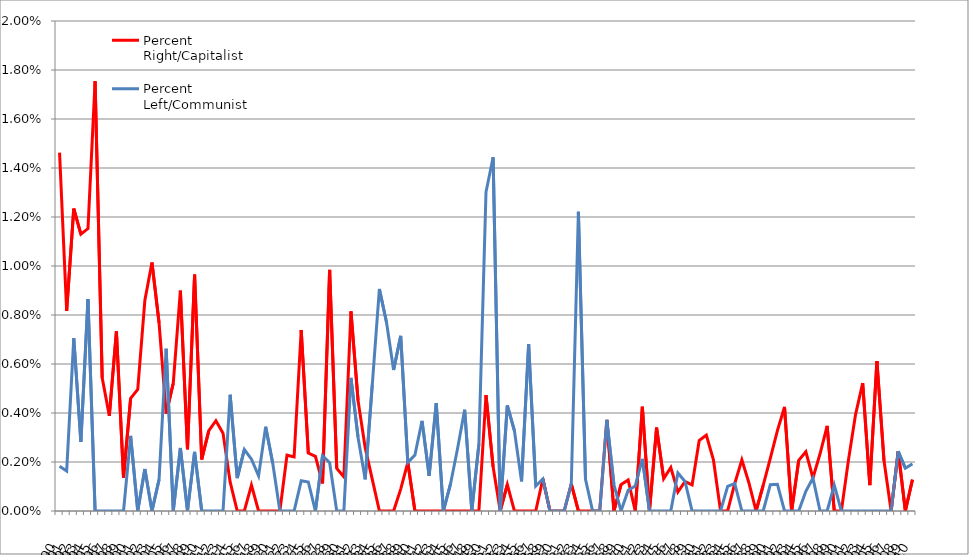
| Category | Percent Right/Capitalist | Percent Left/Communist |
|---|---|---|
| 1890.0 | 0.015 | 0.002 |
| 1891.0 | 0.008 | 0.002 |
| 1892.0 | 0.012 | 0.007 |
| 1893.0 | 0.011 | 0.003 |
| 1894.0 | 0.012 | 0.009 |
| 1895.0 | 0.018 | 0 |
| 1896.0 | 0.005 | 0 |
| 1897.0 | 0.004 | 0 |
| 1898.0 | 0.007 | 0 |
| 1899.0 | 0.001 | 0 |
| 1900.0 | 0.005 | 0.003 |
| 1901.0 | 0.005 | 0 |
| 1902.0 | 0.009 | 0.002 |
| 1903.0 | 0.01 | 0 |
| 1904.0 | 0.008 | 0.001 |
| 1905.0 | 0.004 | 0.007 |
| 1906.0 | 0.005 | 0 |
| 1907.0 | 0.009 | 0.003 |
| 1908.0 | 0.003 | 0 |
| 1909.0 | 0.01 | 0.002 |
| 1910.0 | 0.002 | 0 |
| 1911.0 | 0.003 | 0 |
| 1912.0 | 0.004 | 0 |
| 1913.0 | 0.003 | 0 |
| 1914.0 | 0.001 | 0.005 |
| 1915.0 | 0 | 0.001 |
| 1916.0 | 0 | 0.003 |
| 1917.0 | 0.001 | 0.002 |
| 1918.0 | 0 | 0.001 |
| 1919.0 | 0 | 0.003 |
| 1920.0 | 0 | 0.002 |
| 1921.0 | 0 | 0 |
| 1922.0 | 0.002 | 0 |
| 1923.0 | 0.002 | 0 |
| 1924.0 | 0.007 | 0.001 |
| 1925.0 | 0.002 | 0.001 |
| 1926.0 | 0.002 | 0 |
| 1927.0 | 0.001 | 0.002 |
| 1928.0 | 0.01 | 0.002 |
| 1929.0 | 0.002 | 0 |
| 1930.0 | 0.001 | 0 |
| 1931.0 | 0.008 | 0.005 |
| 1932.0 | 0.005 | 0.003 |
| 1933.0 | 0.003 | 0.001 |
| 1934.0 | 0.001 | 0.005 |
| 1935.0 | 0 | 0.009 |
| 1936.0 | 0 | 0.008 |
| 1937.0 | 0 | 0.006 |
| 1938.0 | 0.001 | 0.007 |
| 1939.0 | 0.002 | 0.002 |
| 1940.0 | 0 | 0.002 |
| 1941.0 | 0 | 0.004 |
| 1942.0 | 0 | 0.001 |
| 1943.0 | 0 | 0.004 |
| 1944.0 | 0 | 0 |
| 1945.0 | 0 | 0.001 |
| 1946.0 | 0 | 0.003 |
| 1947.0 | 0 | 0.004 |
| 1948.0 | 0 | 0 |
| 1949.0 | 0 | 0.003 |
| 1950.0 | 0.005 | 0.013 |
| 1951.0 | 0.002 | 0.014 |
| 1952.0 | 0 | 0 |
| 1953.0 | 0.001 | 0.004 |
| 1954.0 | 0 | 0.003 |
| 1955.0 | 0 | 0.001 |
| 1956.0 | 0 | 0.007 |
| 1957.0 | 0 | 0.001 |
| 1958.0 | 0.001 | 0.001 |
| 1959.0 | 0 | 0 |
| 1960.0 | 0 | 0 |
| 1961.0 | 0 | 0 |
| 1962.0 | 0.001 | 0.001 |
| 1963.0 | 0 | 0.012 |
| 1964.0 | 0 | 0.001 |
| 1965.0 | 0 | 0 |
| 1966.0 | 0 | 0 |
| 1967.0 | 0.004 | 0.004 |
| 1968.0 | 0 | 0.001 |
| 1969.0 | 0.001 | 0 |
| 1970.0 | 0.001 | 0.001 |
| 1971.0 | 0 | 0.001 |
| 1972.0 | 0.004 | 0.002 |
| 1973.0 | 0 | 0 |
| 1974.0 | 0.003 | 0 |
| 1975.0 | 0.001 | 0 |
| 1976.0 | 0.002 | 0 |
| 1977.0 | 0.001 | 0.002 |
| 1978.0 | 0.001 | 0.001 |
| 1979.0 | 0.001 | 0 |
| 1980.0 | 0.003 | 0 |
| 1981.0 | 0.003 | 0 |
| 1982.0 | 0.002 | 0 |
| 1983.0 | 0 | 0 |
| 1984.0 | 0 | 0.001 |
| 1985.0 | 0.001 | 0.001 |
| 1986.0 | 0.002 | 0 |
| 1987.0 | 0.001 | 0 |
| 1988.0 | 0 | 0 |
| 1989.0 | 0.001 | 0 |
| 1990.0 | 0.002 | 0.001 |
| 1991.0 | 0.003 | 0.001 |
| 1992.0 | 0.004 | 0 |
| 1993.0 | 0 | 0 |
| 1994.0 | 0.002 | 0 |
| 1995.0 | 0.002 | 0.001 |
| 1996.0 | 0.001 | 0.001 |
| 1997.0 | 0.002 | 0 |
| 1998.0 | 0.003 | 0 |
| 1999.0 | 0 | 0.001 |
| 2000.0 | 0 | 0 |
| 2001.0 | 0.002 | 0 |
| 2002.0 | 0.004 | 0 |
| 2003.0 | 0.005 | 0 |
| 2004.0 | 0.001 | 0 |
| 2005.0 | 0.006 | 0 |
| 2006.0 | 0.002 | 0 |
| 2007.0 | 0 | 0 |
| 2008.0 | 0.002 | 0.002 |
| 2009.0 | 0 | 0.002 |
| 2010.0 | 0.001 | 0.002 |